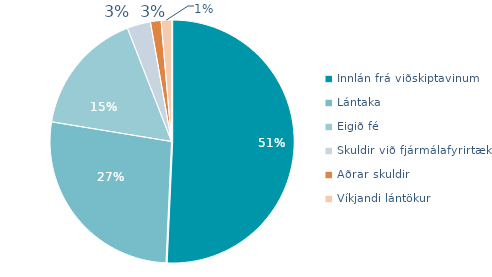
| Category | Series 0 |
|---|---|
| Innlán frá viðskiptavinum | 793427 |
| Lántaka | 420178 |
| Eigið fé | 258255 |
| Skuldir við fjármálafyrirtæki | 48725 |
| Aðrar skuldir | 22196 |
| Víkjandi lántökur | 21366 |